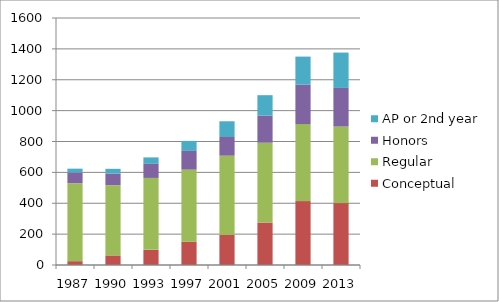
| Category | Conceptual | Regular | Honors | AP or 2nd year |
|---|---|---|---|---|
| 1987.0 | 25 | 505 | 69 | 25 |
| 1990.0 | 62 | 455 | 75 | 31 |
| 1993.0 | 98 | 466 | 91 | 42 |
| 1997.0 | 151 | 467 | 121 | 65 |
| 2001.0 | 195 | 513 | 121 | 102 |
| 2005.0 | 275 | 517 | 176 | 132 |
| 2009.0 | 414 | 499 | 255 | 182 |
| 2013.0 | 401 | 496 | 250 | 229 |